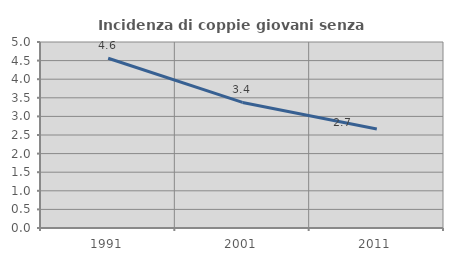
| Category | Incidenza di coppie giovani senza figli |
|---|---|
| 1991.0 | 4.563 |
| 2001.0 | 3.376 |
| 2011.0 | 2.661 |